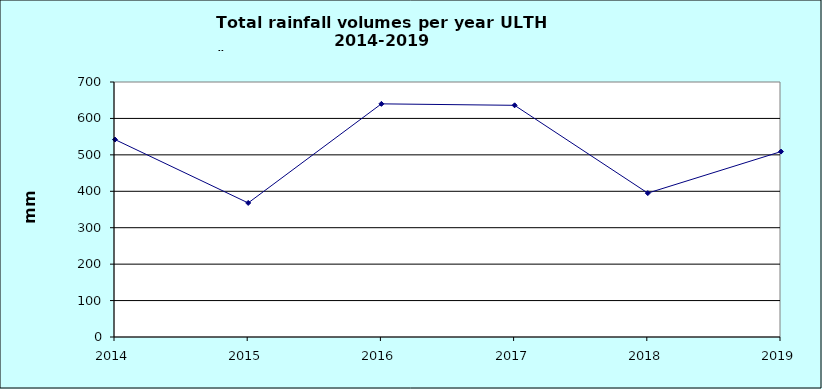
| Category | Series 0 |
|---|---|
| 2014.0 | 542 |
| 2015.0 | 368 |
| 2016.0 | 640 |
| 2017.0 | 636 |
| 2018.0 | 395 |
| 2019.0 | 509 |